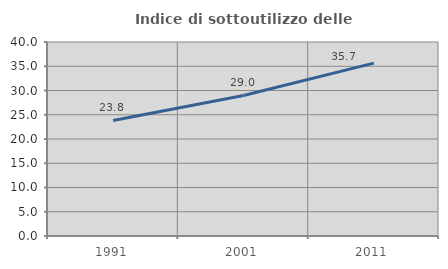
| Category | Indice di sottoutilizzo delle abitazioni  |
|---|---|
| 1991.0 | 23.819 |
| 2001.0 | 28.974 |
| 2011.0 | 35.651 |